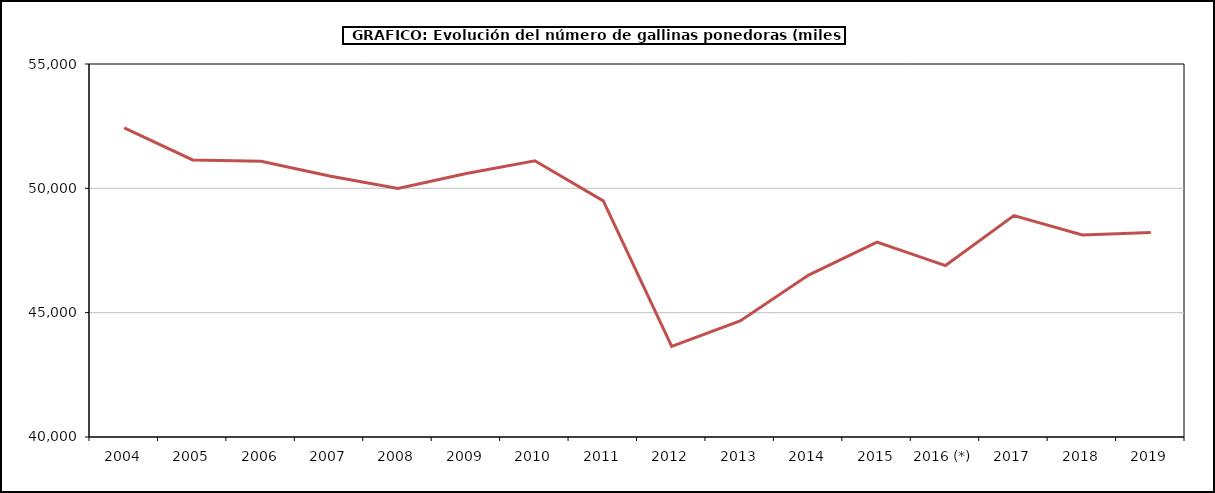
| Category | Series 1 |
|---|---|
| 2004 | 52432.67 |
| 2005 | 51141.084 |
| 2006 | 51089.874 |
| 2007 | 50494.963 |
| 2008 | 49994.952 |
| 2009 | 50593.247 |
| 2010 | 51108 |
| 2011 | 49494.204 |
| 2012 | 43642.944 |
| 2013 | 44667.904 |
| 2014 | 46512.999 |
| 2015 | 47835.268 |
| 2016 (*) | 46894 |
| 2017 | 48904.099 |
| 2018 | 48121.599 |
| 2019 | 48227.692 |